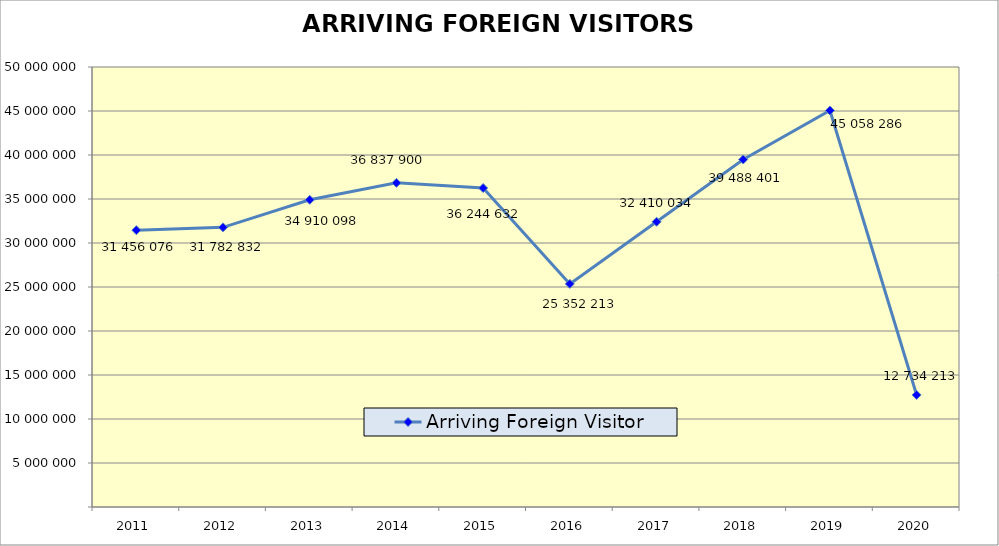
| Category | Arriving Foreign Visitor |
|---|---|
| 2011.0 | 31456076 |
| 2012.0 | 31782832 |
| 2013.0 | 34910098 |
| 2014.0 | 36837900 |
| 2015.0 | 36244632 |
| 2016.0 | 25352213 |
| 2017.0 | 32410034 |
| 2018.0 | 39488401 |
| 2019.0 | 45058286 |
| 2020.0 | 12734213 |